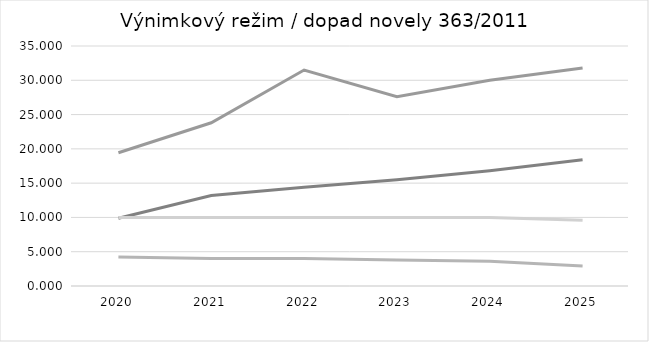
| Category | EMA OMP | In-label | Avastin | Others |
|---|---|---|---|---|
| 2020 | 9.876 | 19.432 | 4.24 | 9.976 |
| 2021 | 13.2 | 23.8 | 4 | 10 |
| 2022 | 14.4 | 31.5 | 4 | 10 |
| 2023 | 15.5 | 27.6 | 3.8 | 10 |
| 2024 | 16.8 | 30 | 3.6 | 10 |
| 2025 | 18.4 | 31.8 | 2.9 | 9.6 |